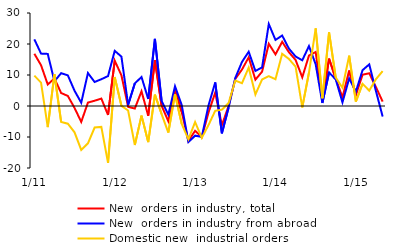
| Category | New  orders in industry, total | New  orders in industry from abroad  | Domestic new  industrial orders   |
|---|---|---|---|
|  1/11 | 16.85 | 21.514 | 9.807 |
| 2 | 13.154 | 16.901 | 7.528 |
| 3 | 6.938 | 16.802 | -6.819 |
| 4 | 8.892 | 7.984 | 10.239 |
| 5 | 4.188 | 10.586 | -5.137 |
| 6 | 3.246 | 9.886 | -5.724 |
| 7 | -0.623 | 4.925 | -8.5 |
| 8 | -5.126 | 1.058 | -14.145 |
| 9 | 1.1 | 10.634 | -12.039 |
| 10 | 1.704 | 7.748 | -6.953 |
| 11 | 2.394 | 8.637 | -6.752 |
| 12 | -2.894 | 9.651 | -18.333 |
|  1/12 | 14.624 | 17.793 | 9.33 |
| 2 | 9.896 | 15.93 | 0.05 |
| 3 | -0.281 | 0.391 | -1.457 |
| 4 | -0.814 | 7.288 | -12.59 |
| 5 | 4.741 | 9.357 | -3.102 |
| 6 | -3.143 | 2.261 | -11.653 |
| 7 | 14.815 | 21.663 | 3.666 |
| 8 | 0.079 | 1.643 | -2.606 |
| 9 | -4.895 | -2.779 | -8.562 |
| 10 | 5.379 | 6.356 | 3.757 |
| 11 | -1.932 | 0.32 | -5.774 |
| 12 | -11.272 | -11.592 | -10.744 |
|  1/13 | -7.998 | -9.564 | -5.178 |
| 2 | -10.043 | -9.916 | -10.282 |
| 3 | -2.123 | 0.136 | -6.148 |
| 4 | 4.313 | 7.599 | -1.549 |
| 5 | -6.195 | -8.805 | -1.189 |
| 6 | 0.019 | -0.489 | 0.944 |
| 7 | 8.758 | 9.042 | 8.215 |
| 8 | 11.759 | 14.22 | 7.351 |
| 9 | 15.703 | 17.505 | 12.38 |
| 10 | 8.495 | 11.308 | 3.714 |
| 11 | 11.071 | 12.451 | 8.563 |
| 12 | 20.066 | 26.446 | 9.623 |
|  1/14 | 16.65 | 21.317 | 8.636 |
| 2 | 20.7 | 22.734 | 16.838 |
| 3 | 17.373 | 18.524 | 15.183 |
| 4 | 14.857 | 15.971 | 12.685 |
| 5 | 9.263 | 14.744 | -0.437 |
| 6 | 16.27 | 19.328 | 10.776 |
| 7 | 17.423 | 13.455 | 25.062 |
| 8 | 1.496 | 0.97 | 2.498 |
| 9 | 15.254 | 10.831 | 23.777 |
| 10 | 8.78 | 8.559 | 9.184 |
| 11 | 2.802 | 1.167 | 5.878 |
| 12 | 11.436 | 8.896 | 16.231 |
|  1/15 | 3.519 | 4.614 | 1.42 |
| 2 | 10.09 | 11.56 | 7.158 |
| 3 | 10.559 | 13.422 | 4.96 |
| 4 | 6.091 | 4.811 | 8.658 |
| 5 | 1.418 | -3.406 | 11.257 |